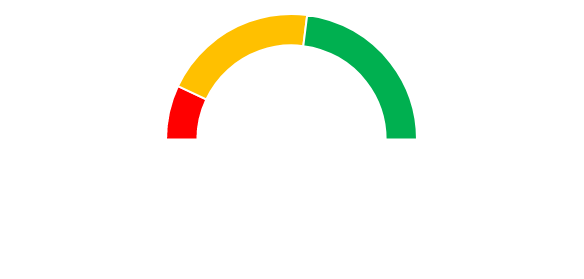
| Category | Series 0 |
|---|---|
| Bílá | 50 |
| Červená | 7 |
| Žlutá | 20 |
| Zelená | 23 |